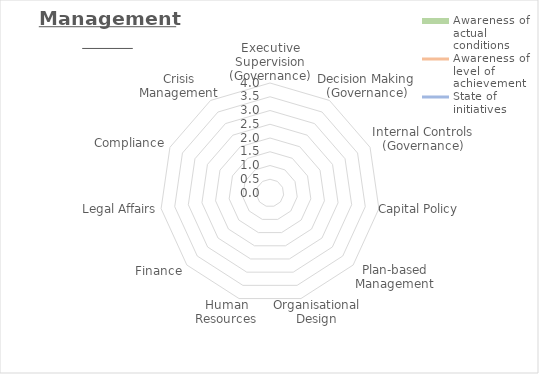
| Category | Awareness of actual conditions | Awareness of level of achievement | State of initiatives |
|---|---|---|---|
| 0 | 0 | 0 | 0 |
| 1 | 0 | 0 | 0 |
| 2 | 0 | 0 | 0 |
| 3 | 0 | 0 | 0 |
| 4 | 0 | 0 | 0 |
| 5 | 0 | 0 | 0 |
| 6 | 0 | 0 | 0 |
| 7 | 0 | 0 | 0 |
| 8 | 0 | 0 | 0 |
| 9 | 0 | 0 | 0 |
| 10 | 0 | 0 | 0 |